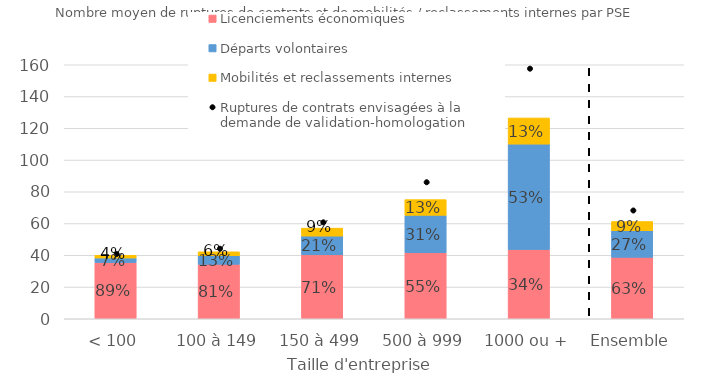
| Category | Licenciements économiques | Départs volontaires | Mobilités et reclassements internes |
|---|---|---|---|
| < 100 | 35.422 | 2.895 | 1.698 |
| 100 à 149 | 34.278 | 5.462 | 2.455 |
| 150 à 499 | 40.269 | 11.804 | 5.033 |
| 500 à 999 | 41.561 | 23.602 | 9.883 |
| 1000 ou + | 43.591 | 66.42 | 16.495 |
| Ensemble | 38.692 | 16.775 | 5.797 |